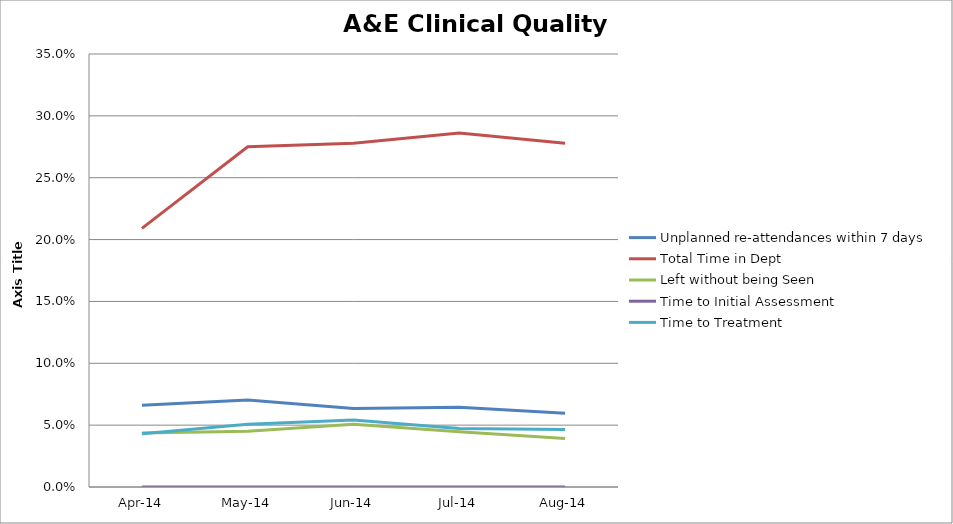
| Category | Unplanned re-attendances within 7 days | Total Time in Dept  | Left without being Seen | Time to Initial Assessment | Time to Treatment |
|---|---|---|---|---|---|
| 2014-04-01 | 0.066 | 0.209 | 0.044 | 0 | 0.043 |
| 2014-05-01 | 0.07 | 0.275 | 0.045 | 0 | 0.051 |
| 2014-06-01 | 0.063 | 0.278 | 0.051 | 0 | 0.054 |
| 2014-07-01 | 0.065 | 0.286 | 0.045 | 0 | 0.047 |
| 2014-08-01 | 0.06 | 0.278 | 0.039 | 0 | 0.047 |